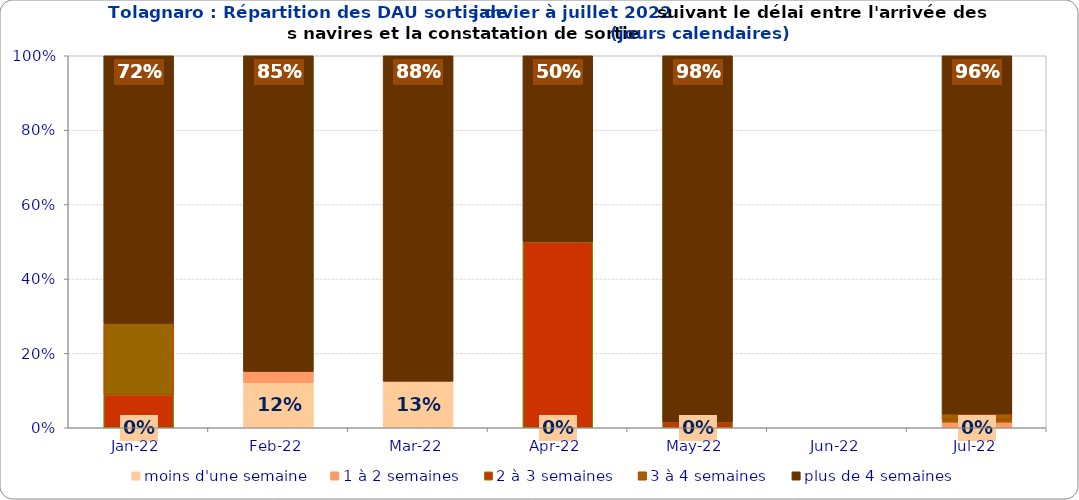
| Category | moins d'une semaine | 1 à 2 semaines | 2 à 3 semaines | 3 à 4 semaines | plus de 4 semaines |
|---|---|---|---|---|---|
| 2022-01-01 | 0 | 0 | 0.088 | 0.193 | 0.719 |
| 2022-02-01 | 0.121 | 0.03 | 0 | 0 | 0.848 |
| 2022-03-01 | 0.125 | 0 | 0 | 0 | 0.875 |
| 2022-04-01 | 0 | 0 | 0.5 | 0 | 0.5 |
| 2022-05-01 | 0 | 0 | 0.015 | 0 | 0.985 |
| 2022-06-01 | 0 | 0 | 0 | 0 | 0 |
| 2022-07-01 | 0 | 0.015 | 0.007 | 0.015 | 0.963 |